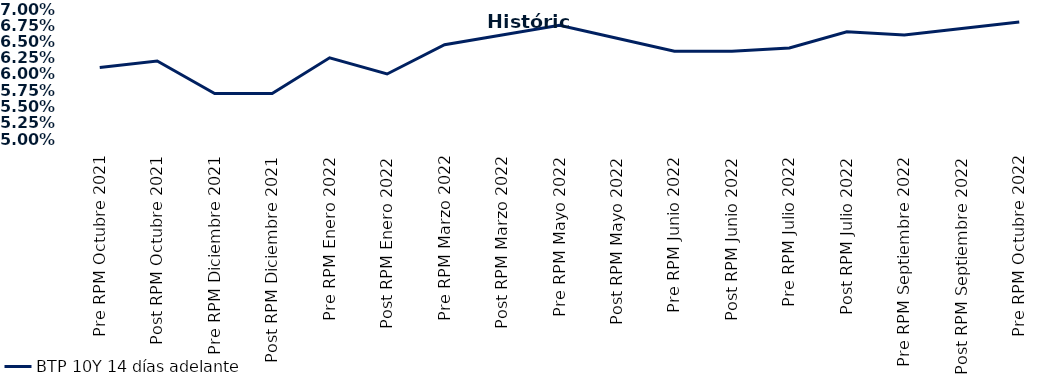
| Category | BTP 10Y 14 días adelante |
|---|---|
| Pre RPM Octubre 2021 | 0.061 |
| Post RPM Octubre 2021 | 0.062 |
| Pre RPM Diciembre 2021 | 0.057 |
| Post RPM Diciembre 2021 | 0.057 |
| Pre RPM Enero 2022 | 0.062 |
| Post RPM Enero 2022 | 0.06 |
| Pre RPM Marzo 2022 | 0.064 |
| Post RPM Marzo 2022 | 0.066 |
| Pre RPM Mayo 2022 | 0.068 |
| Post RPM Mayo 2022 | 0.066 |
| Pre RPM Junio 2022 | 0.064 |
| Post RPM Junio 2022 | 0.064 |
| Pre RPM Julio 2022 | 0.064 |
| Post RPM Julio 2022 | 0.066 |
| Pre RPM Septiembre 2022 | 0.066 |
| Post RPM Septiembre 2022 | 0.067 |
| Pre RPM Octubre 2022 | 0.068 |